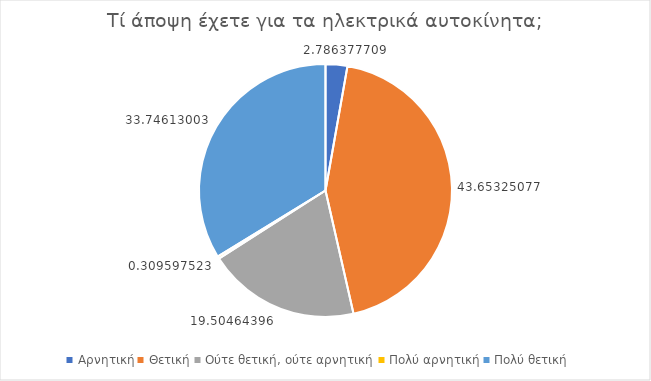
| Category | Series 0 |
|---|---|
| Αρνητική | 2.786 |
| Θετική | 43.653 |
| Ούτε θετική, ούτε αρνητική | 19.505 |
| Πολύ αρνητική | 0.31 |
| Πολύ θετική | 33.746 |